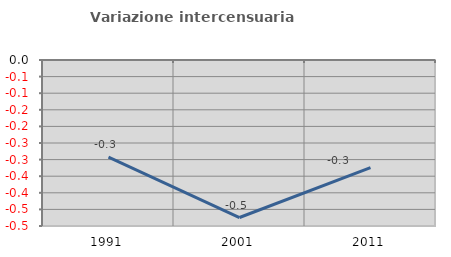
| Category | Variazione intercensuaria annua |
|---|---|
| 1991.0 | -0.293 |
| 2001.0 | -0.474 |
| 2011.0 | -0.324 |